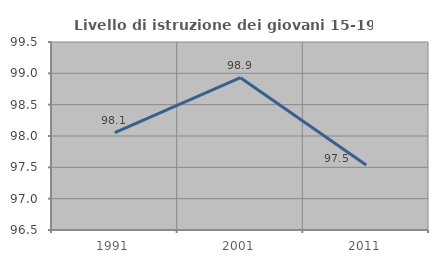
| Category | Livello di istruzione dei giovani 15-19 anni |
|---|---|
| 1991.0 | 98.054 |
| 2001.0 | 98.93 |
| 2011.0 | 97.537 |